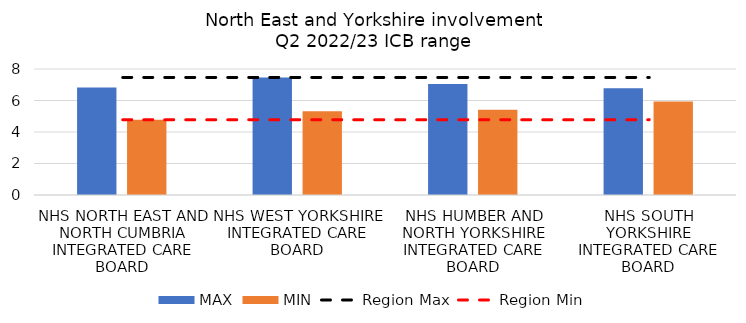
| Category | MAX | MIN |
|---|---|---|
| NHS NORTH EAST AND NORTH CUMBRIA INTEGRATED CARE BOARD | 6.833 | 4.778 |
| NHS WEST YORKSHIRE INTEGRATED CARE BOARD | 7.465 | 5.316 |
| NHS HUMBER AND NORTH YORKSHIRE INTEGRATED CARE BOARD | 7.049 | 5.406 |
| NHS SOUTH YORKSHIRE INTEGRATED CARE BOARD | 6.785 | 5.933 |